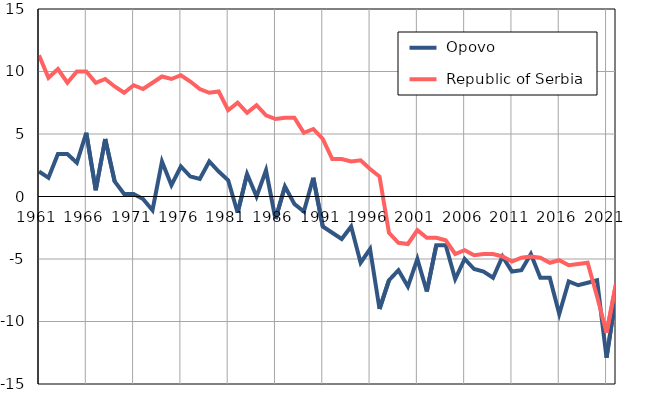
| Category |  Opovo |  Republic of Serbia |
|---|---|---|
| 1961.0 | 2 | 11.3 |
| 1962.0 | 1.5 | 9.5 |
| 1963.0 | 3.4 | 10.2 |
| 1964.0 | 3.4 | 9.1 |
| 1965.0 | 2.7 | 10 |
| 1966.0 | 5.1 | 10 |
| 1967.0 | 0.5 | 9.1 |
| 1968.0 | 4.6 | 9.4 |
| 1969.0 | 1.2 | 8.8 |
| 1970.0 | 0.2 | 8.3 |
| 1971.0 | 0.2 | 8.9 |
| 1972.0 | -0.2 | 8.6 |
| 1973.0 | -1.1 | 9.1 |
| 1974.0 | 2.8 | 9.6 |
| 1975.0 | 0.9 | 9.4 |
| 1976.0 | 2.4 | 9.7 |
| 1977.0 | 1.6 | 9.2 |
| 1978.0 | 1.4 | 8.6 |
| 1979.0 | 2.8 | 8.3 |
| 1980.0 | 2 | 8.4 |
| 1981.0 | 1.3 | 6.9 |
| 1982.0 | -1.3 | 7.5 |
| 1983.0 | 1.8 | 6.7 |
| 1984.0 | 0 | 7.3 |
| 1985.0 | 2.1 | 6.5 |
| 1986.0 | -1.8 | 6.2 |
| 1987.0 | 0.8 | 6.3 |
| 1988.0 | -0.6 | 6.3 |
| 1989.0 | -1.2 | 5.1 |
| 1990.0 | 1.5 | 5.4 |
| 1991.0 | -2.4 | 4.6 |
| 1992.0 | -2.9 | 3 |
| 1993.0 | -3.4 | 3 |
| 1994.0 | -2.4 | 2.8 |
| 1995.0 | -5.3 | 2.9 |
| 1996.0 | -4.2 | 2.2 |
| 1997.0 | -9 | 1.6 |
| 1998.0 | -6.7 | -2.9 |
| 1999.0 | -5.9 | -3.7 |
| 2000.0 | -7.2 | -3.8 |
| 2001.0 | -5 | -2.7 |
| 2002.0 | -7.6 | -3.3 |
| 2003.0 | -3.9 | -3.3 |
| 2004.0 | -3.9 | -3.5 |
| 2005.0 | -6.6 | -4.6 |
| 2006.0 | -5 | -4.3 |
| 2007.0 | -5.8 | -4.7 |
| 2008.0 | -6 | -4.6 |
| 2009.0 | -6.5 | -4.6 |
| 2010.0 | -4.8 | -4.8 |
| 2011.0 | -6 | -5.2 |
| 2012.0 | -5.9 | -4.9 |
| 2013.0 | -4.6 | -4.8 |
| 2014.0 | -6.5 | -4.9 |
| 2015.0 | -6.5 | -5.3 |
| 2016.0 | -9.4 | -5.1 |
| 2017.0 | -6.8 | -5.5 |
| 2018.0 | -7.1 | -5.4 |
| 2019.0 | -6.9 | -5.3 |
| 2020.0 | -6.7 | -8 |
| 2021.0 | -12.9 | -10.9 |
| 2022.0 | -7.9 | -7 |